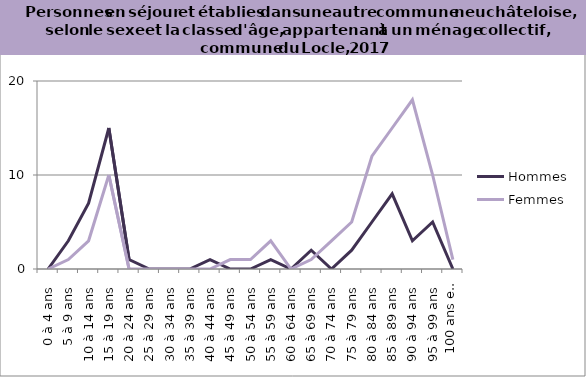
| Category | Hommes | Femmes |
|---|---|---|
| 0 à 4 ans | 0 | 0 |
| 5 à 9 ans | 3 | 1 |
| 10 à 14 ans | 7 | 3 |
| 15 à 19 ans | 15 | 10 |
| 20 à 24 ans | 1 | 0 |
| 25 à 29 ans | 0 | 0 |
| 30 à 34 ans | 0 | 0 |
| 35 à 39 ans | 0 | 0 |
| 40 à 44 ans | 1 | 0 |
| 45 à 49 ans | 0 | 1 |
| 50 à 54 ans | 0 | 1 |
| 55 à 59 ans | 1 | 3 |
| 60 à 64 ans | 0 | 0 |
| 65 à 69 ans | 2 | 1 |
| 70 à 74 ans | 0 | 3 |
| 75 à 79 ans | 2 | 5 |
| 80 à 84 ans | 5 | 12 |
| 85 à 89 ans | 8 | 15 |
| 90 à 94 ans | 3 | 18 |
| 95 à 99 ans | 5 | 10 |
| 100 ans et plus | 0 | 1 |